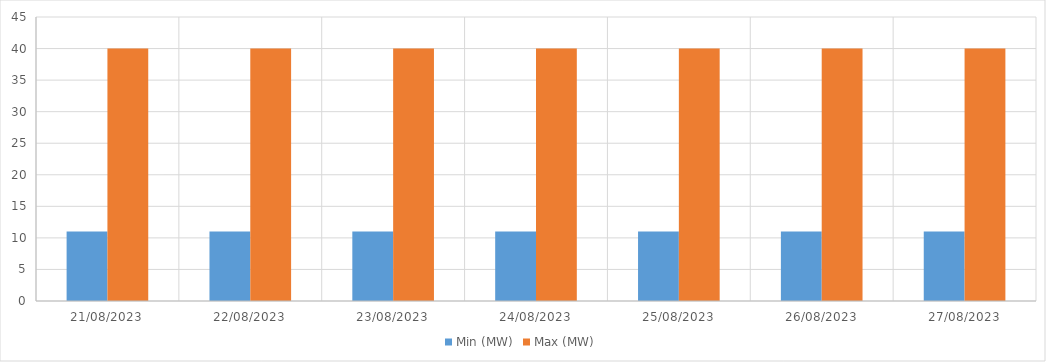
| Category | Min (MW) | Max (MW) |
|---|---|---|
| 21/08/2023 | 11 | 40 |
| 22/08/2023 | 11 | 40 |
| 23/08/2023 | 11 | 40 |
| 24/08/2023 | 11 | 40 |
| 25/08/2023 | 11 | 40 |
| 26/08/2023 | 11 | 40 |
| 27/08/2023 | 11 | 40 |